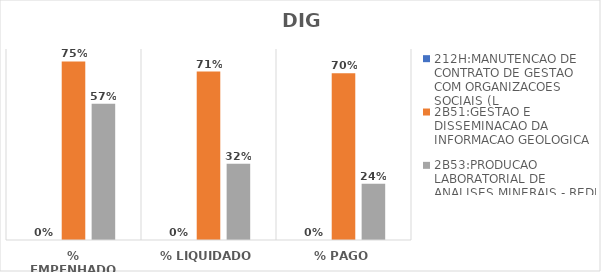
| Category | 212H:MANUTENCAO DE CONTRATO DE GESTAO COM ORGANIZACOES SOCIAIS (L | 2B51:GESTAO E DISSEMINACAO DA INFORMACAO GEOLOGICA | 2B53:PRODUCAO LABORATORIAL DE ANALISES MINERAIS - REDE LAMIN |
|---|---|---|---|
| % EMPENHADO | 0 | 0.748 | 0.571 |
| % LIQUIDADO | 0 | 0.706 | 0.32 |
| % PAGO | 0 | 0.698 | 0.236 |